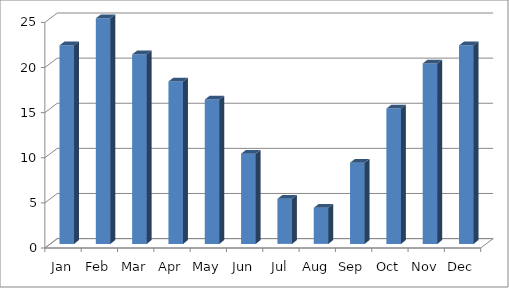
| Category | Series 0 |
|---|---|
| Jan | 22 |
| Feb | 25 |
| Mar | 21 |
| Apr | 18 |
| May | 16 |
| Jun | 10 |
| Jul | 5 |
| Aug | 4 |
| Sep | 9 |
| Oct | 15 |
| Nov | 20 |
| Dec | 22 |